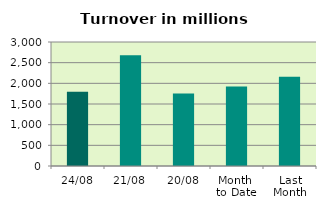
| Category | Series 0 |
|---|---|
| 24/08 | 1796.285 |
| 21/08 | 2682.098 |
| 20/08 | 1757.04 |
| Month 
to Date | 1922.354 |
| Last
Month | 2162.227 |